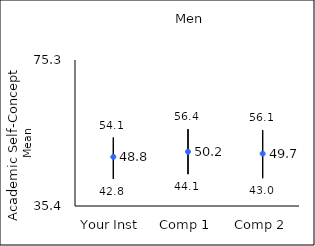
| Category | 25th percentile | 75th percentile | Mean |
|---|---|---|---|
| Your Inst | 42.8 | 54.1 | 48.82 |
| Comp 1 | 44.1 | 56.4 | 50.23 |
| Comp 2 | 43 | 56.1 | 49.71 |